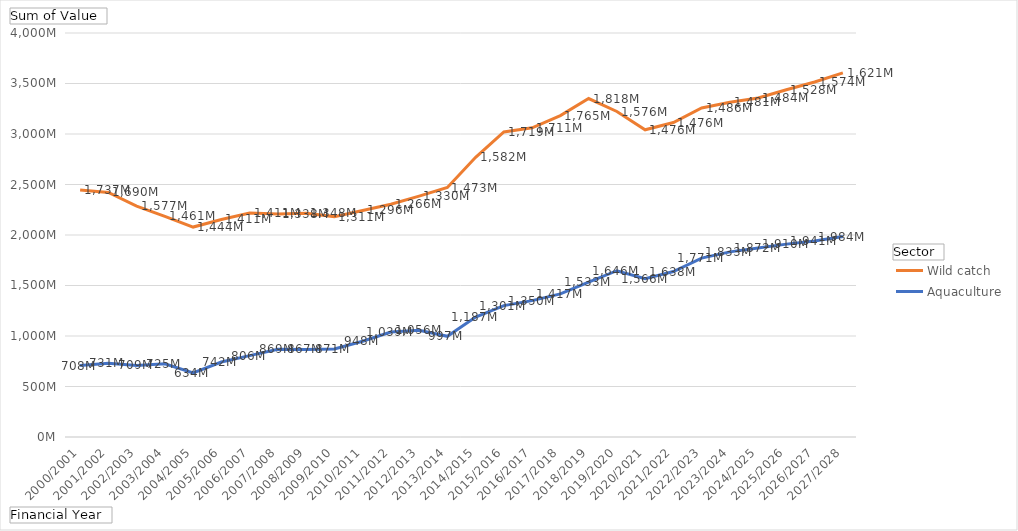
| Category | Aquaculture | Wild catch |
|---|---|---|
| 2000/2001 | 707700590 | 1737429840 |
| 2001/2002 | 731165470 | 1689853540 |
| 2002/2003 | 708865830 | 1577042910.2 |
| 2003/2004 | 724597460 | 1460603490 |
| 2004/2005 | 634082470 | 1444487990 |
| 2005/2006 | 742343760 | 1411419160 |
| 2006/2007 | 806014700 | 1410696060 |
| 2007/2008 | 869257920 | 1337830420 |
| 2008/2009 | 866712370 | 1347571490 |
| 2009/2010 | 870755740 | 1311287420 |
| 2010/2011 | 947667470 | 1295624720 |
| 2011/2012 | 1039283950 | 1265592800 |
| 2012/2013 | 1055753940 | 1329624890 |
| 2013/2014 | 996817540 | 1473015000 |
| 2014/2015 | 1186881340 | 1581988230 |
| 2015/2016 | 1301078990 | 1719012500 |
| 2016/2017 | 1350018670 | 1710971130 |
| 2017/2018 | 1417192320 | 1765434116.146 |
| 2018/2019 | 1533332263.268 | 1817611770.601 |
| 2019/2020 | 1646218160.356 | 1576497071.051 |
| 2020/2021 | 1566218489.436 | 1475560062.483 |
| 2021/2022 | 1638135760.51 | 1475575820.153 |
| 2022/2023 | 1771338014.35 | 1486157364.537 |
| 2023/2024 | 1833034783.392 | 1480973923.832 |
| 2024/2025 | 1872142622.49 | 1483846437.881 |
| 2025/2026 | 1909637628.805 | 1528361831.017 |
| 2026/2027 | 1941070776.039 | 1574212685.948 |
| 2027/2028 | 1984171926.974 | 1621439066.526 |